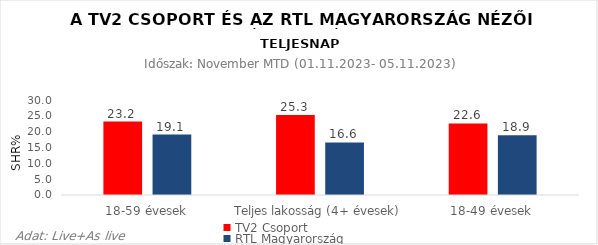
| Category | TV2 Csoport | RTL Magyarország |
|---|---|---|
| 18-59 évesek | 23.2 | 19.1 |
| Teljes lakosság (4+ évesek) | 25.3 | 16.6 |
| 18-49 évesek | 22.6 | 18.9 |